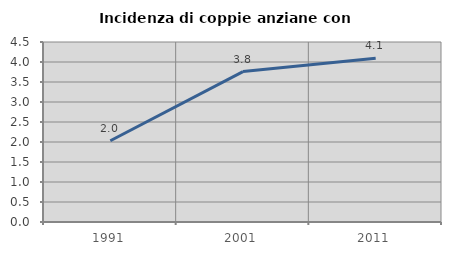
| Category | Incidenza di coppie anziane con figli |
|---|---|
| 1991.0 | 2.032 |
| 2001.0 | 3.76 |
| 2011.0 | 4.097 |